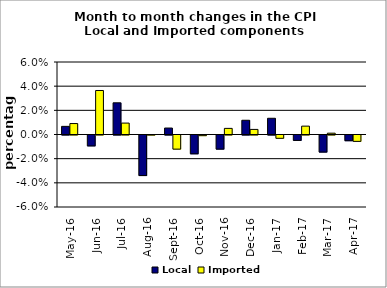
| Category | Local | Imported |
|---|---|---|
| 2016-05-01 | 0.007 | 0.009 |
| 2016-06-01 | -0.009 | 0.036 |
| 2016-07-01 | 0.026 | 0.009 |
| 2016-08-01 | -0.034 | 0 |
| 2016-09-01 | 0.005 | -0.012 |
| 2016-10-01 | -0.016 | -0.001 |
| 2016-11-01 | -0.012 | 0.005 |
| 2016-12-01 | 0.012 | 0.004 |
| 2017-01-01 | 0.013 | -0.003 |
| 2017-02-01 | -0.004 | 0.007 |
| 2017-03-01 | -0.014 | 0.001 |
| 2017-04-01 | -0.005 | -0.005 |